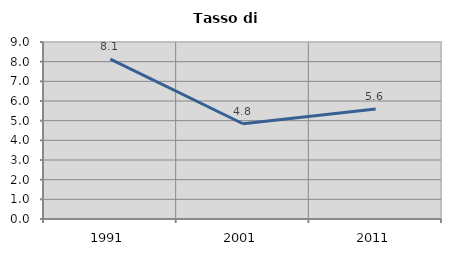
| Category | Tasso di disoccupazione   |
|---|---|
| 1991.0 | 8.124 |
| 2001.0 | 4.844 |
| 2011.0 | 5.598 |